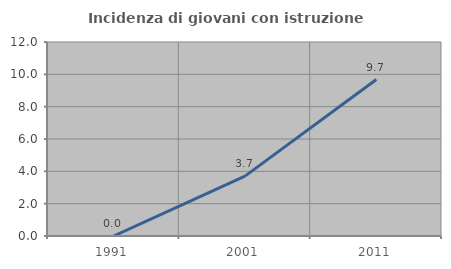
| Category | Incidenza di giovani con istruzione universitaria |
|---|---|
| 1991.0 | 0 |
| 2001.0 | 3.704 |
| 2011.0 | 9.677 |